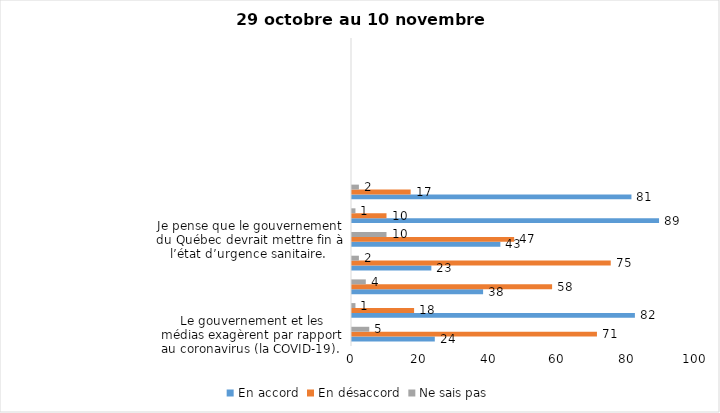
| Category | En accord | En désaccord | Ne sais pas |
|---|---|---|---|
| Le gouvernement et les médias exagèrent par rapport au coronavirus (la COVID-19). | 24 | 71 | 5 |
| Je suis favorable au passeport vaccinal qui permettrait l'accès à certains lieux ou activités aux personnes vaccinées. | 82 | 18 | 1 |
| Je suis favorable à ce que le port du masque ne soit plus obligatoire au Québec. | 38 | 58 | 4 |
| Je juge que les mesures contre la COVID-19 vont à l'encontre des droits et libertés individuelles.  | 23 | 75 | 2 |
| Je pense que le gouvernement du Québec devrait mettre fin à l’état d’urgence sanitaire.  | 43 | 47 | 10 |
| Les personnes adéquatement vaccinées contre la COVID-19 sont responsables et bienfaisantes envers la société. | 89 | 10 | 1 |
| Les personnes non adéquatement vaccinées contre la COVID-19 sont responsables des novueaux cas et hospitalisations et contribuent à la prolongation de la pandémie au Québec. | 81 | 17 | 2 |